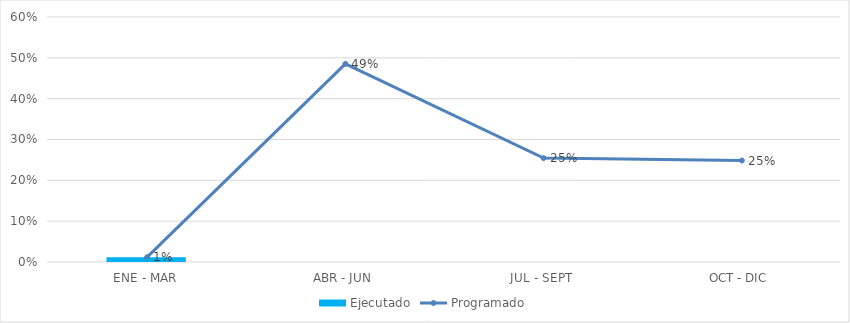
| Category | Ejecutado |
|---|---|
| ENE - MAR | 0.012 |
| ABR - JUN | 0 |
| JUL - SEPT | 0 |
| OCT - DIC | 0 |